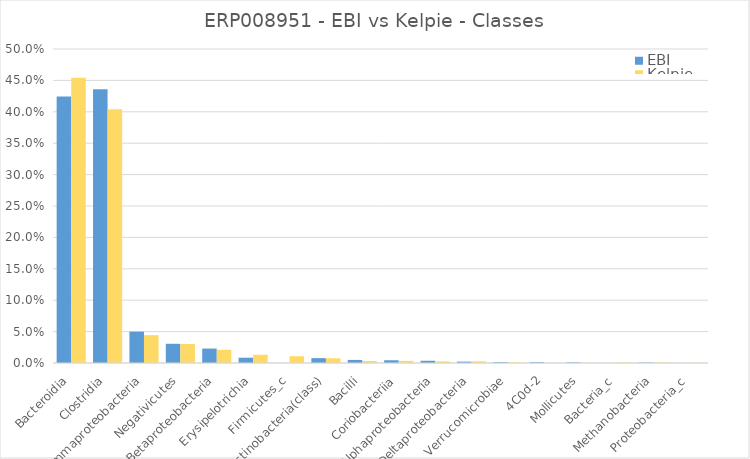
| Category | EBI | Kelpie |
|---|---|---|
| Bacteroidia | 0.424 | 0.454 |
| Clostridia | 0.436 | 0.404 |
| Gammaproteobacteria | 0.05 | 0.044 |
| Negativicutes | 0.031 | 0.03 |
| Betaproteobacteria | 0.023 | 0.021 |
| Erysipelotrichia | 0.008 | 0.013 |
| Firmicutes_c | 0 | 0.011 |
| Actinobacteria(class) | 0.008 | 0.007 |
| Bacilli | 0.005 | 0.003 |
| Coriobacteriia | 0.004 | 0.003 |
| Alphaproteobacteria | 0.004 | 0.003 |
| Deltaproteobacteria | 0.002 | 0.003 |
| Verrucomicrobiae | 0.001 | 0.001 |
| 4C0d-2 | 0.001 | 0 |
| Mollicutes | 0.001 | 0 |
| Bacteria_c | 0 | 0.001 |
| Methanobacteria | 0.001 | 0.001 |
| Proteobacteria_c | 0 | 0 |